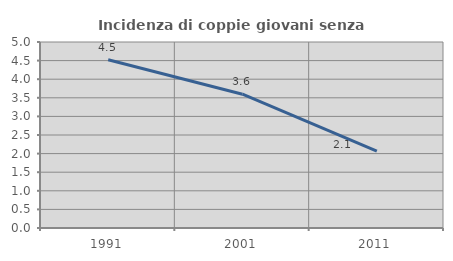
| Category | Incidenza di coppie giovani senza figli |
|---|---|
| 1991.0 | 4.523 |
| 2001.0 | 3.597 |
| 2011.0 | 2.069 |